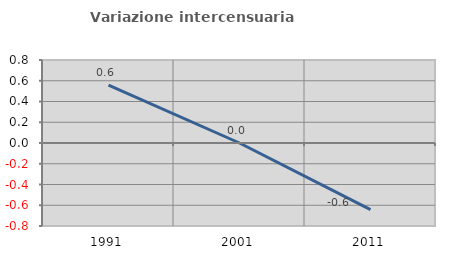
| Category | Variazione intercensuaria annua |
|---|---|
| 1991.0 | 0.558 |
| 2001.0 | 0 |
| 2011.0 | -0.643 |